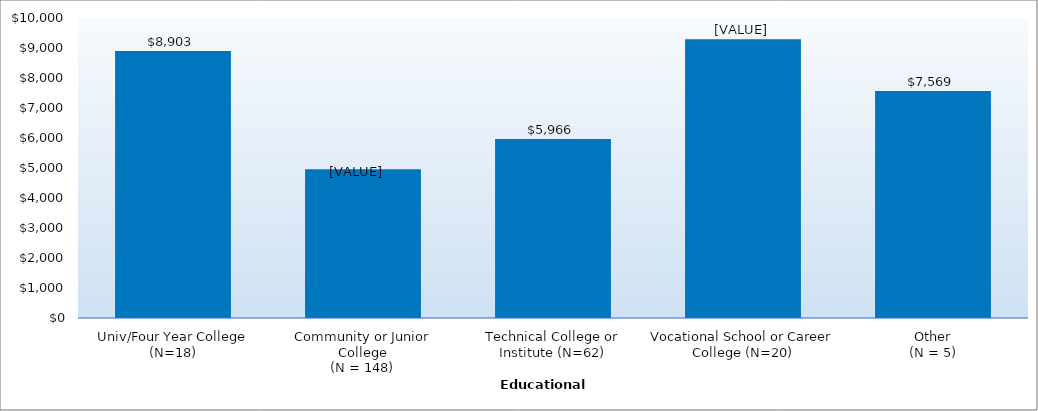
| Category | Series 0 |
|---|---|
| Univ/Four Year College (N=18) | 8903 |
| Community or Junior College
(N = 148) | 4962 |
| Technical College or Institute (N=62) | 5966 |
| Vocational School or Career College (N=20) | 9291 |
| Other
(N = 5) | 7569 |